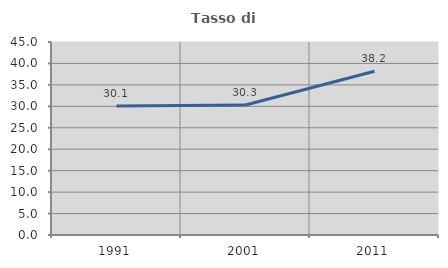
| Category | Tasso di occupazione   |
|---|---|
| 1991.0 | 30.072 |
| 2001.0 | 30.303 |
| 2011.0 | 38.17 |